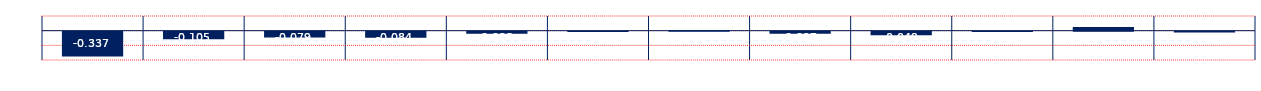
| Category | -0.337 |
|---|---|
| Mar 24, Apr 24 | -0.337 |
| Apr 24, May 24 | -0.105 |
| May 24, Jun 24 | -0.079 |
| Jun 24, Jul 24 | -0.084 |
| Jul 24, Aug 24 | -0.028 |
| Aug 24, Sep 24 | -0.003 |
| Sep 24, Oct 24 | 0.005 |
| Oct 24, Nov 24 | -0.027 |
| Nov 24, Dec 24 | -0.049 |
| Dec 24, Jan 25 | -0.005 |
| Jan 25, Feb 25 | 0.051 |
| Feb 25, Mar 25 | -0.012 |